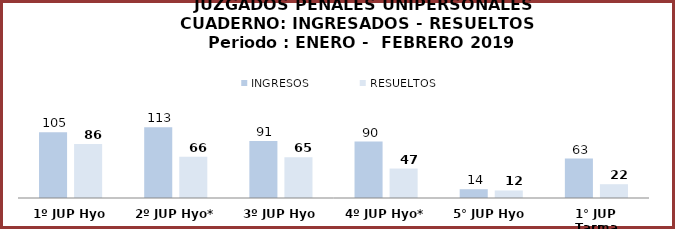
| Category | INGRESOS | RESUELTOS |
|---|---|---|
| 1º JUP Hyo | 105 | 86 |
| 2º JUP Hyo* | 113 | 66 |
| 3º JUP Hyo | 91 | 65 |
| 4º JUP Hyo* | 90 | 47 |
| 5° JUP Hyo | 14 | 12 |
| 1° JUP Tarma | 63 | 22 |